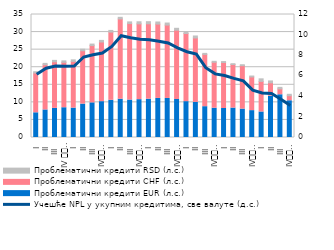
| Category | Проблематични кредити EUR (л.с.) | Проблематични кредити CHF (л.с.) | Проблематични кредити RSD (л.с.) |
|---|---|---|---|
| I | 7.031 | 11.315 | 0.376 |
| II | 7.838 | 12.854 | 0.398 |
| III | 8.287 | 13.256 | 0.398 |
| IV 
2013. | 8.472 | 12.907 | 0.424 |
| I | 8.364 | 13.289 | 0.434 |
| II | 9.502 | 15.183 | 0.445 |
| III | 9.861 | 16.293 | 0.431 |
| IV
2014. | 10.2 | 16.966 | 0.464 |
| I | 10.588 | 19.402 | 0.479 |
| II | 10.907 | 22.828 | 0.467 |
| III | 10.661 | 21.759 | 0.479 |
| IV
2015. | 10.774 | 21.561 | 0.595 |
| I | 10.906 | 21.449 | 0.603 |
| II | 11.118 | 21.151 | 0.6 |
| III | 11.109 | 20.882 | 0.585 |
| IV
2016. | 10.82 | 19.717 | 0.539 |
| I | 10.204 | 19.386 | 0.539 |
| II | 10.002 | 18.325 | 0.564 |
| III | 8.771 | 14.875 | 0.29 |
| IV
2017. | 8.337 | 13.073 | 0.274 |
| I | 8.247 | 13.09 | 0.266 |
| II | 8.373 | 12.384 | 0.241 |
| III | 8.081 | 12.357 | 0.265 |
| IV
2018. | 7.649 | 9.577 | 0.27 |
| I | 7.26 | 8.704 | 0.728 |
| II | 11.747 | 3.816 | 0.533 |
| III | 12.162 | 1.673 | 0.43 |
| IV
2019. | 10.454 | 1.442 | 0.401 |